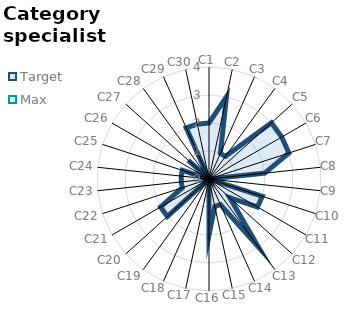
| Category | Target | Max |
|---|---|---|
| C1 | 2 | 0 |
| C2 | 3 | 0 |
| C3 | 1 | 0 |
| C4 | 1 | 0 |
| C5 | 3 | 0 |
| C6 | 3 | 0 |
| C7 | 3 | 0 |
| C8 | 2 | 0 |
| C9 | 0 | 0 |
| C10 | 2 | 0 |
| C11 | 2 | 0 |
| C12 | 1 | 0 |
| C13 | 3 | 0 |
| C14 | 1 | 0 |
| C15 | 1 | 0 |
| C16 | 2 | 0 |
| C17 | 0 | 0 |
| C18 | 0 | 0 |
| C19 | 0 | 0 |
| C20 | 2 | 0 |
| C21 | 2 | 0 |
| C22 | 1 | 0 |
| C23 | 1 | 0 |
| C24 | 1 | 0 |
| C25 | 1 | 0 |
| C26 | 0 | 0 |
| C27 | 1 | 0 |
| C28 | 0 | 0 |
| C29 | 2 | 0 |
| C30 | 2 | 0 |